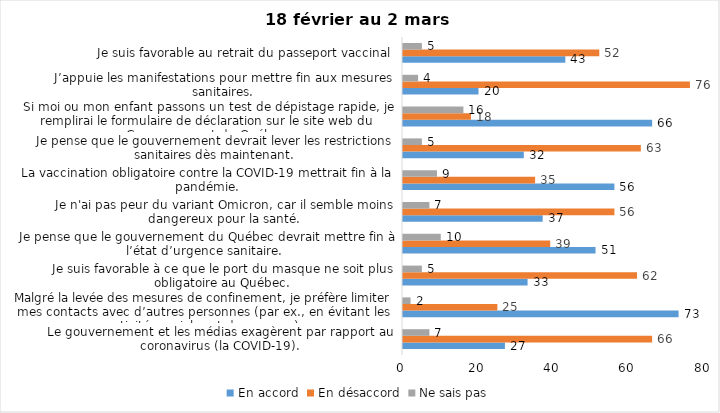
| Category | En accord | En désaccord | Ne sais pas |
|---|---|---|---|
| Le gouvernement et les médias exagèrent par rapport au coronavirus (la COVID-19). | 27 | 66 | 7 |
| Malgré la levée des mesures de confinement, je préfère limiter mes contacts avec d’autres personnes (par ex., en évitant les activités sociales et de groupes) | 73 | 25 | 2 |
| Je suis favorable à ce que le port du masque ne soit plus obligatoire au Québec. | 33 | 62 | 5 |
| Je pense que le gouvernement du Québec devrait mettre fin à l’état d’urgence sanitaire.  | 51 | 39 | 10 |
| Je n'ai pas peur du variant Omicron, car il semble moins dangereux pour la santé. | 37 | 56 | 7 |
| La vaccination obligatoire contre la COVID-19 mettrait fin à la pandémie. | 56 | 35 | 9 |
| Je pense que le gouvernement devrait lever les restrictions sanitaires dès maintenant. | 32 | 63 | 5 |
| Si moi ou mon enfant passons un test de dépistage rapide, je remplirai le formulaire de déclaration sur le site web du Gouvernement du Québec. | 66 | 18 | 16 |
| J’appuie les manifestations pour mettre fin aux mesures sanitaires. | 20 | 76 | 4 |
| Je suis favorable au retrait du passeport vaccinal | 43 | 52 | 5 |